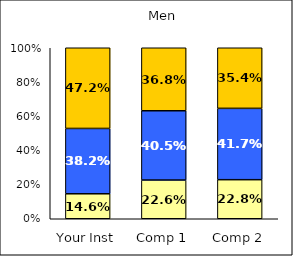
| Category | Low Leadership | Average Leadership | High Leadership |
|---|---|---|---|
| Your Inst | 0.146 | 0.382 | 0.472 |
| Comp 1 | 0.226 | 0.405 | 0.368 |
| Comp 2 | 0.228 | 0.417 | 0.354 |